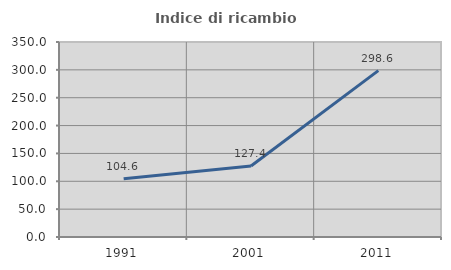
| Category | Indice di ricambio occupazionale  |
|---|---|
| 1991.0 | 104.608 |
| 2001.0 | 127.404 |
| 2011.0 | 298.601 |